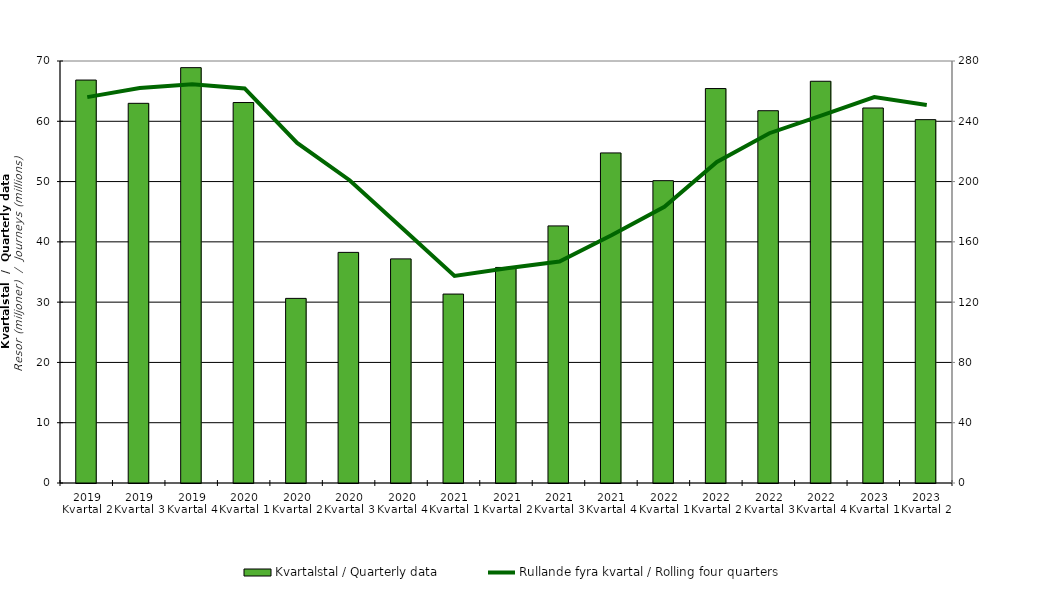
| Category | Kvartalstal / Quarterly data |
|---|---|
| 2019 Kvartal 2 | 66.84 |
| 2019 Kvartal 3 | 62.979 |
| 2019 Kvartal 4 | 68.898 |
| 2020 Kvartal 1 | 63.109 |
| 2020 Kvartal 2 | 30.624 |
| 2020 Kvartal 3 | 38.255 |
| 2020 Kvartal 4 | 37.175 |
| 2021 Kvartal 1 | 31.339 |
| 2021 Kvartal 2 | 35.757 |
| 2021 Kvartal 3 | 42.645 |
| 2021 Kvartal 4 | 54.75 |
| 2022 Kvartal 1 | 50.15 |
| 2022 Kvartal 2 | 65.43 |
| 2022 Kvartal 3 | 61.753 |
| 2022 Kvartal 4 | 66.639 |
| 2023 Kvartal 1 | 62.204 |
| 2023 Kvartal 2 | 60.272 |